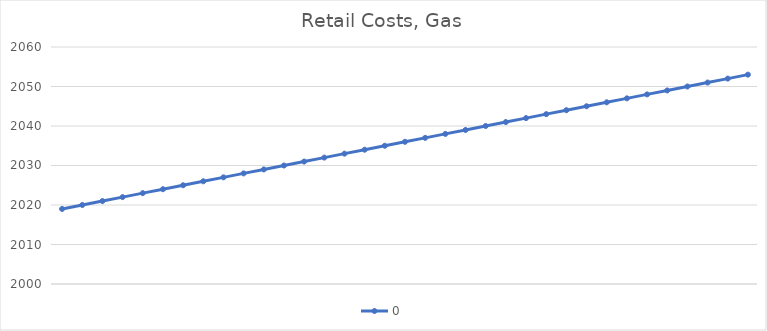
| Category | 0 |
|---|---|
|  | 2019 |
|  | 2020 |
|  | 2021 |
|  | 2022 |
|  | 2023 |
|  | 2024 |
|  | 2025 |
|  | 2026 |
|  | 2027 |
|  | 2028 |
|  | 2029 |
|  | 2030 |
|  | 2031 |
|  | 2032 |
|  | 2033 |
|  | 2034 |
|  | 2035 |
|  | 2036 |
|  | 2037 |
|  | 2038 |
|  | 2039 |
|  | 2040 |
|  | 2041 |
|  | 2042 |
|  | 2043 |
|  | 2044 |
|  | 2045 |
|  | 2046 |
|  | 2047 |
|  | 2048 |
|  | 2049 |
|  | 2050 |
|  | 2051 |
|  | 2052 |
|  | 2053 |